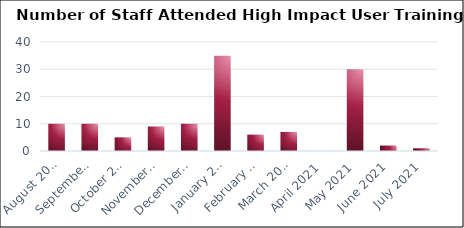
| Category | Series 0 |
|---|---|
| August 2020 | 10 |
| September 2020 | 10 |
| October 2020 | 5 |
| November 2020 | 9 |
| December 2020 | 10 |
| January 2021 | 35 |
| February 2021  | 6 |
| March 2021 | 7 |
| April 2021 | 0 |
| May 2021 | 30 |
| June 2021 | 2 |
| July 2021 | 1 |